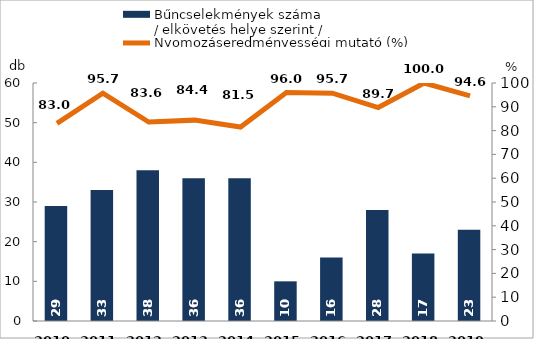
| Category | Bűncselekmények száma
/ elkövetés helye szerint / |
|---|---|
| 2010. év | 29 |
| 2011. év | 33 |
| 2012. év | 38 |
| 2013. év | 36 |
| 2014. év | 36 |
| 2015. év | 10 |
| 2016. év | 16 |
| 2017. év | 28 |
| 2018. év | 17 |
| 2019. év | 23 |